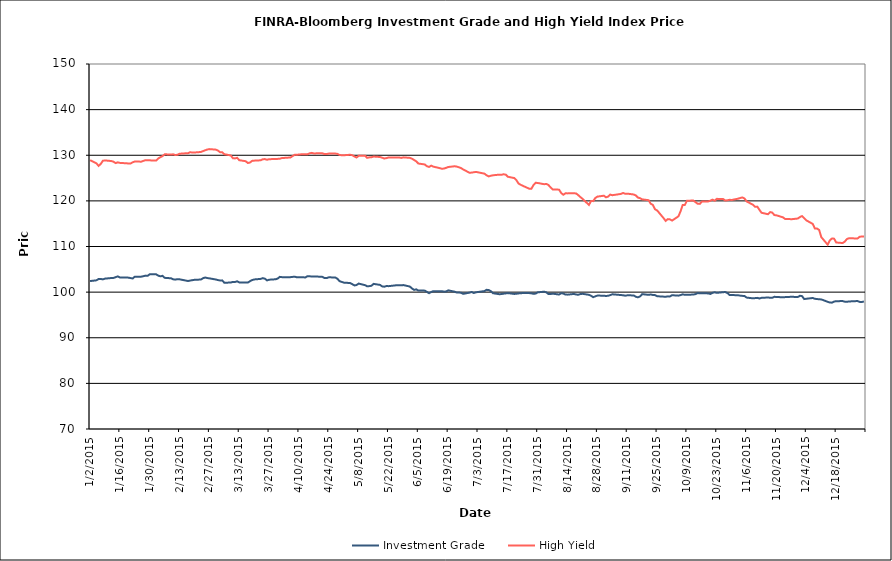
| Category | Investment Grade | High Yield |
|---|---|---|
| 1/2/15 | 102.426 | 128.911 |
| 1/5/15 | 102.586 | 128.223 |
| 1/6/15 | 102.878 | 127.662 |
| 1/7/15 | 102.893 | 128.095 |
| 1/8/15 | 102.797 | 128.789 |
| 1/9/15 | 102.956 | 128.868 |
| 1/12/15 | 103.094 | 128.728 |
| 1/13/15 | 103.116 | 128.583 |
| 1/14/15 | 103.282 | 128.28 |
| 1/15/15 | 103.445 | 128.444 |
| 1/16/15 | 103.218 | 128.331 |
| 1/20/15 | 103.176 | 128.203 |
| 1/21/15 | 103.074 | 128.203 |
| 1/22/15 | 102.998 | 128.455 |
| 1/23/15 | 103.395 | 128.628 |
| 1/26/15 | 103.388 | 128.595 |
| 1/27/15 | 103.486 | 128.767 |
| 1/28/15 | 103.616 | 128.923 |
| 1/29/15 | 103.575 | 128.896 |
| 1/30/15 | 103.915 | 128.884 |
| 2/2/15 | 103.902 | 128.826 |
| 2/3/15 | 103.611 | 129.307 |
| 2/4/15 | 103.464 | 129.573 |
| 2/5/15 | 103.571 | 129.826 |
| 2/6/15 | 103.134 | 130.204 |
| 2/9/15 | 103.034 | 130.169 |
| 2/10/15 | 102.809 | 130.199 |
| 2/11/15 | 102.739 | 130.053 |
| 2/12/15 | 102.846 | 130.105 |
| 2/13/15 | 102.803 | 130.334 |
| 2/17/15 | 102.437 | 130.465 |
| 2/18/15 | 102.543 | 130.673 |
| 2/19/15 | 102.623 | 130.581 |
| 2/20/15 | 102.701 | 130.602 |
| 2/23/15 | 102.76 | 130.717 |
| 2/24/15 | 103.054 | 130.904 |
| 2/25/15 | 103.205 | 131.093 |
| 2/26/15 | 103.084 | 131.259 |
| 2/27/15 | 103.014 | 131.346 |
| 3/2/15 | 102.766 | 131.232 |
| 3/3/15 | 102.641 | 131.019 |
| 3/4/15 | 102.55 | 130.662 |
| 3/5/15 | 102.571 | 130.64 |
| 3/6/15 | 102.05 | 130.229 |
| 3/9/15 | 102.107 | 129.958 |
| 3/10/15 | 102.236 | 129.348 |
| 3/11/15 | 102.218 | 129.308 |
| 3/12/15 | 102.373 | 129.437 |
| 3/13/15 | 102.12 | 128.915 |
| 3/16/15 | 102.092 | 128.692 |
| 3/17/15 | 102.088 | 128.301 |
| 3/18/15 | 102.392 | 128.399 |
| 3/19/15 | 102.637 | 128.765 |
| 3/20/15 | 102.778 | 128.818 |
| 3/23/15 | 102.9 | 128.891 |
| 3/24/15 | 103.067 | 129.136 |
| 3/25/15 | 102.948 | 129.155 |
| 3/26/15 | 102.572 | 129.012 |
| 3/27/15 | 102.722 | 129.135 |
| 3/30/15 | 102.816 | 129.18 |
| 3/31/15 | 102.97 | 129.203 |
| 4/1/15 | 103.346 | 129.242 |
| 4/2/15 | 103.283 | 129.384 |
| 4/6/15 | 103.281 | 129.514 |
| 4/7/15 | 103.339 | 129.813 |
| 4/8/15 | 103.385 | 130.12 |
| 4/9/15 | 103.25 | 130.08 |
| 4/10/15 | 103.269 | 130.183 |
| 4/13/15 | 103.225 | 130.222 |
| 4/14/15 | 103.502 | 130.217 |
| 4/15/15 | 103.476 | 130.43 |
| 4/16/15 | 103.412 | 130.52 |
| 4/17/15 | 103.448 | 130.393 |
| 4/20/15 | 103.374 | 130.451 |
| 4/21/15 | 103.344 | 130.415 |
| 4/22/15 | 103.073 | 130.258 |
| 4/23/15 | 103.075 | 130.272 |
| 4/24/15 | 103.252 | 130.37 |
| 4/27/15 | 103.2 | 130.372 |
| 4/28/15 | 102.95 | 130.305 |
| 4/29/15 | 102.411 | 130.069 |
| 4/30/15 | 102.251 | 129.999 |
| 5/1/15 | 102.081 | 130.001 |
| 5/4/15 | 101.991 | 130.107 |
| 5/5/15 | 101.745 | 130.012 |
| 5/6/15 | 101.469 | 129.725 |
| 5/7/15 | 101.552 | 129.512 |
| 5/8/15 | 101.879 | 129.87 |
| 5/11/15 | 101.525 | 129.898 |
| 5/12/15 | 101.269 | 129.438 |
| 5/13/15 | 101.316 | 129.534 |
| 5/14/15 | 101.397 | 129.569 |
| 5/15/15 | 101.81 | 129.716 |
| 5/18/15 | 101.582 | 129.614 |
| 5/19/15 | 101.262 | 129.456 |
| 5/20/15 | 101.187 | 129.294 |
| 5/21/15 | 101.333 | 129.372 |
| 5/22/15 | 101.31 | 129.503 |
| 5/26/15 | 101.519 | 129.524 |
| 5/27/15 | 101.506 | 129.504 |
| 5/28/15 | 101.507 | 129.417 |
| 5/29/15 | 101.544 | 129.539 |
| 6/1/15 | 101.222 | 129.422 |
| 6/2/15 | 100.801 | 129.253 |
| 6/3/15 | 100.493 | 128.955 |
| 6/4/15 | 100.607 | 128.669 |
| 6/5/15 | 100.338 | 128.185 |
| 6/8/15 | 100.328 | 127.981 |
| 6/9/15 | 100.063 | 127.603 |
| 6/10/15 | 99.766 | 127.441 |
| 6/11/15 | 100.019 | 127.722 |
| 6/12/15 | 100.209 | 127.509 |
| 6/15/15 | 100.183 | 127.18 |
| 6/16/15 | 100.204 | 127.036 |
| 6/17/15 | 100.102 | 127.086 |
| 6/18/15 | 100.13 | 127.235 |
| 6/19/15 | 100.39 | 127.422 |
| 6/22/15 | 100.096 | 127.586 |
| 6/23/15 | 99.909 | 127.511 |
| 6/24/15 | 99.918 | 127.359 |
| 6/25/15 | 99.854 | 127.195 |
| 6/26/15 | 99.62 | 126.893 |
| 6/29/15 | 99.884 | 126.158 |
| 6/30/15 | 100.037 | 126.2 |
| 7/1/15 | 99.808 | 126.273 |
| 7/2/15 | 99.959 | 126.354 |
| 7/6/15 | 100.232 | 125.966 |
| 7/7/15 | 100.504 | 125.596 |
| 7/8/15 | 100.46 | 125.367 |
| 7/9/15 | 100.206 | 125.508 |
| 7/10/15 | 99.759 | 125.61 |
| 7/13/15 | 99.543 | 125.751 |
| 7/14/15 | 99.576 | 125.717 |
| 7/15/15 | 99.661 | 125.833 |
| 7/16/15 | 99.721 | 125.742 |
| 7/17/15 | 99.787 | 125.286 |
| 7/20/15 | 99.6 | 124.999 |
| 7/21/15 | 99.649 | 124.522 |
| 7/22/15 | 99.72 | 123.795 |
| 7/23/15 | 99.744 | 123.523 |
| 7/24/15 | 99.803 | 123.3 |
| 7/27/15 | 99.786 | 122.67 |
| 7/28/15 | 99.739 | 122.649 |
| 7/29/15 | 99.618 | 123.461 |
| 7/30/15 | 99.685 | 123.964 |
| 7/31/15 | 99.954 | 123.922 |
| 8/3/15 | 100.094 | 123.653 |
| 8/4/15 | 99.962 | 123.719 |
| 8/5/15 | 99.584 | 123.491 |
| 8/6/15 | 99.586 | 122.954 |
| 8/7/15 | 99.668 | 122.503 |
| 8/10/15 | 99.471 | 122.46 |
| 8/11/15 | 99.769 | 121.721 |
| 8/12/15 | 99.692 | 121.342 |
| 8/13/15 | 99.468 | 121.66 |
| 8/14/15 | 99.448 | 121.642 |
| 8/17/15 | 99.602 | 121.654 |
| 8/18/15 | 99.477 | 121.633 |
| 8/19/15 | 99.424 | 121.252 |
| 8/20/15 | 99.586 | 120.824 |
| 8/21/15 | 99.626 | 120.461 |
| 8/24/15 | 99.414 | 119.113 |
| 8/25/15 | 99.195 | 119.971 |
| 8/26/15 | 98.899 | 119.946 |
| 8/27/15 | 99.074 | 120.628 |
| 8/28/15 | 99.244 | 120.939 |
| 8/31/15 | 99.217 | 121.131 |
| 9/1/15 | 99.152 | 120.781 |
| 9/2/15 | 99.203 | 120.942 |
| 9/3/15 | 99.347 | 121.372 |
| 9/4/15 | 99.526 | 121.243 |
| 9/8/15 | 99.36 | 121.524 |
| 9/9/15 | 99.315 | 121.732 |
| 9/10/15 | 99.219 | 121.563 |
| 9/11/15 | 99.299 | 121.587 |
| 9/14/15 | 99.28 | 121.4 |
| 9/15/15 | 98.987 | 121.19 |
| 9/16/15 | 98.862 | 120.73 |
| 9/17/15 | 99.061 | 120.585 |
| 9/18/15 | 99.563 | 120.333 |
| 9/21/15 | 99.399 | 120.151 |
| 9/22/15 | 99.494 | 119.36 |
| 9/23/15 | 99.371 | 119.122 |
| 9/24/15 | 99.35 | 118.157 |
| 9/25/15 | 99.1 | 117.905 |
| 9/28/15 | 99.012 | 116.226 |
| 9/29/15 | 98.984 | 115.614 |
| 9/30/15 | 99.07 | 116.002 |
| 10/1/15 | 99.06 | 115.948 |
| 10/2/15 | 99.323 | 115.684 |
| 10/5/15 | 99.23 | 116.623 |
| 10/6/15 | 99.352 | 117.736 |
| 10/7/15 | 99.51 | 119.116 |
| 10/8/15 | 99.412 | 119.115 |
| 10/9/15 | 99.403 | 120.047 |
| 10/12/15 | 99.475 | 120.06 |
| 10/13/15 | 99.568 | 119.722 |
| 10/14/15 | 99.799 | 119.376 |
| 10/15/15 | 99.747 | 119.342 |
| 10/16/15 | 99.774 | 119.841 |
| 10/19/15 | 99.716 | 119.878 |
| 10/20/15 | 99.599 | 120.046 |
| 10/21/15 | 99.843 | 120.27 |
| 10/22/15 | 99.962 | 120.041 |
| 10/23/15 | 99.839 | 120.443 |
| 10/26/15 | 99.988 | 120.39 |
| 10/27/15 | 100.024 | 120.083 |
| 10/28/15 | 99.784 | 120.133 |
| 10/29/15 | 99.366 | 120.237 |
| 10/30/15 | 99.366 | 120.195 |
| 11/2/15 | 99.31 | 120.487 |
| 11/3/15 | 99.232 | 120.637 |
| 11/4/15 | 99.181 | 120.753 |
| 11/5/15 | 99.133 | 120.502 |
| 11/6/15 | 98.802 | 119.883 |
| 11/9/15 | 98.639 | 119.13 |
| 11/10/15 | 98.69 | 118.692 |
| 11/11/15 | 98.74 | 118.736 |
| 11/12/15 | 98.611 | 118.014 |
| 11/13/15 | 98.747 | 117.394 |
| 11/16/15 | 98.823 | 117.075 |
| 11/17/15 | 98.766 | 117.548 |
| 11/18/15 | 98.769 | 117.423 |
| 11/19/15 | 98.972 | 116.89 |
| 11/20/15 | 98.935 | 116.829 |
| 11/23/15 | 98.87 | 116.393 |
| 11/24/15 | 98.906 | 116.043 |
| 11/25/15 | 98.93 | 116.051 |
| 11/27/15 | 98.976 | 115.977 |
| 11/30/15 | 98.929 | 116.132 |
| 12/1/15 | 99.197 | 116.463 |
| 12/2/15 | 99.116 | 116.678 |
| 12/3/15 | 98.476 | 116.209 |
| 12/4/15 | 98.55 | 115.723 |
| 12/7/15 | 98.714 | 114.95 |
| 12/8/15 | 98.535 | 113.929 |
| 12/9/15 | 98.493 | 113.937 |
| 12/10/15 | 98.415 | 113.616 |
| 12/11/15 | 98.408 | 112.053 |
| 12/14/15 | 97.875 | 110.398 |
| 12/15/15 | 97.724 | 111.331 |
| 12/16/15 | 97.692 | 111.756 |
| 12/17/15 | 97.923 | 111.719 |
| 12/18/15 | 98.016 | 110.876 |
| 12/21/15 | 98.036 | 110.761 |
| 12/22/15 | 97.906 | 111.06 |
| 12/23/15 | 97.884 | 111.633 |
| 12/24/15 | 97.951 | 111.817 |
| 12/28/15 | 98.048 | 111.751 |
| 12/29/15 | 97.858 | 112.132 |
| 12/30/15 | 97.834 | 112.194 |
| 12/31/15 | 97.954 | 112.164 |